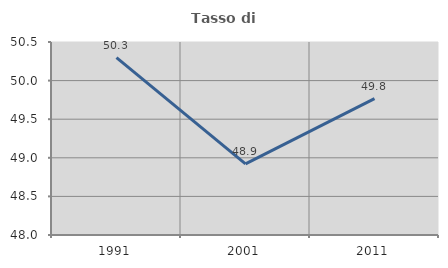
| Category | Tasso di occupazione   |
|---|---|
| 1991.0 | 50.298 |
| 2001.0 | 48.922 |
| 2011.0 | 49.767 |